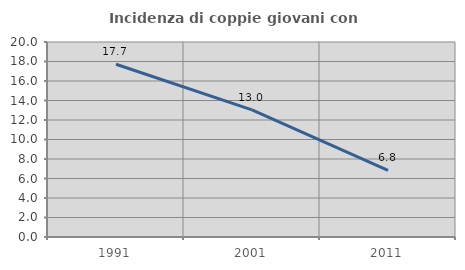
| Category | Incidenza di coppie giovani con figli |
|---|---|
| 1991.0 | 17.722 |
| 2001.0 | 13.043 |
| 2011.0 | 6.823 |